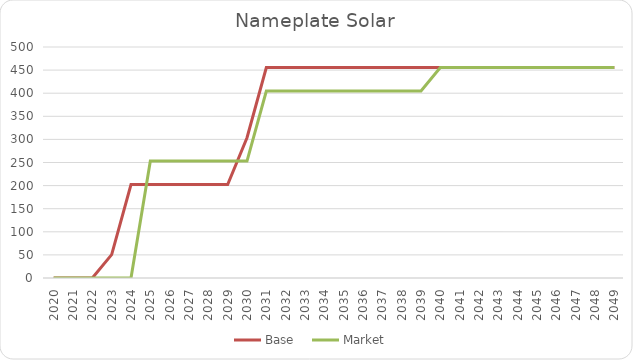
| Category | Base | Market |
|---|---|---|
| 2020.0 | 0 | 0 |
| 2021.0 | 0 | 0 |
| 2022.0 | 0 | 0 |
| 2023.0 | 50.599 | 0 |
| 2024.0 | 202.395 | 0 |
| 2025.0 | 202.395 | 252.994 |
| 2026.0 | 202.395 | 252.994 |
| 2027.0 | 202.395 | 252.994 |
| 2028.0 | 202.395 | 252.994 |
| 2029.0 | 202.395 | 252.994 |
| 2030.0 | 303.593 | 252.994 |
| 2031.0 | 455.389 | 404.791 |
| 2032.0 | 455.389 | 404.791 |
| 2033.0 | 455.389 | 404.791 |
| 2034.0 | 455.389 | 404.791 |
| 2035.0 | 455.389 | 404.791 |
| 2036.0 | 455.389 | 404.791 |
| 2037.0 | 455.389 | 404.791 |
| 2038.0 | 455.389 | 404.791 |
| 2039.0 | 455.389 | 404.791 |
| 2040.0 | 455.389 | 455.389 |
| 2041.0 | 455.389 | 455.389 |
| 2042.0 | 455.389 | 455.389 |
| 2043.0 | 455.389 | 455.389 |
| 2044.0 | 455.389 | 455.389 |
| 2045.0 | 455.389 | 455.389 |
| 2046.0 | 455.389 | 455.389 |
| 2047.0 | 455.389 | 455.389 |
| 2048.0 | 455.389 | 455.389 |
| 2049.0 | 455.389 | 455.389 |